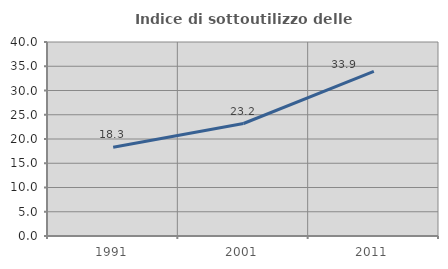
| Category | Indice di sottoutilizzo delle abitazioni  |
|---|---|
| 1991.0 | 18.308 |
| 2001.0 | 23.193 |
| 2011.0 | 33.935 |